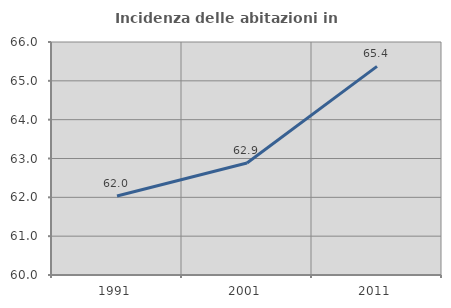
| Category | Incidenza delle abitazioni in proprietà  |
|---|---|
| 1991.0 | 62.034 |
| 2001.0 | 62.886 |
| 2011.0 | 65.373 |